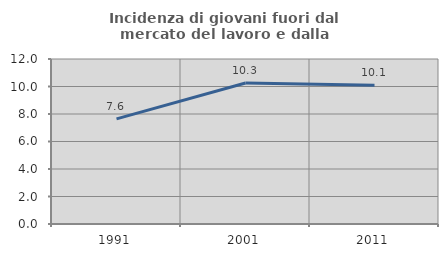
| Category | Incidenza di giovani fuori dal mercato del lavoro e dalla formazione  |
|---|---|
| 1991.0 | 7.648 |
| 2001.0 | 10.252 |
| 2011.0 | 10.092 |